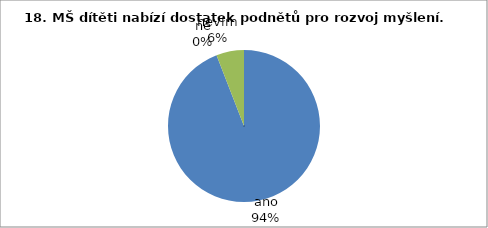
| Category | 18. |
|---|---|
| ano | 32 |
| ne | 0 |
| nevím | 2 |